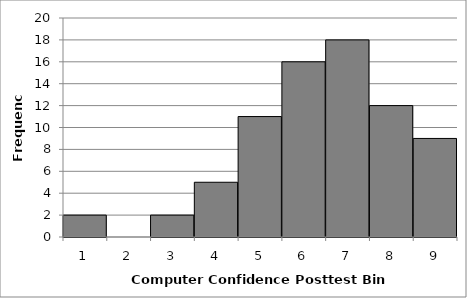
| Category | Series 0 |
|---|---|
| 0 | 2 |
| 1 | 0 |
| 2 | 2 |
| 3 | 5 |
| 4 | 11 |
| 5 | 16 |
| 6 | 18 |
| 7 | 12 |
| 8 | 9 |